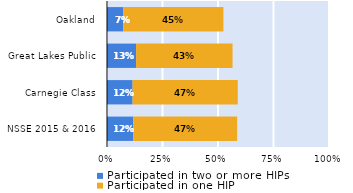
| Category | Participated in two or more HIPs | Participated in one HIP |
|---|---|---|
| NSSE 2015 & 2016 | 0.118 | 0.469 |
| Carnegie Class | 0.115 | 0.474 |
| Great Lakes Public | 0.131 | 0.434 |
| Oakland | 0.073 | 0.451 |